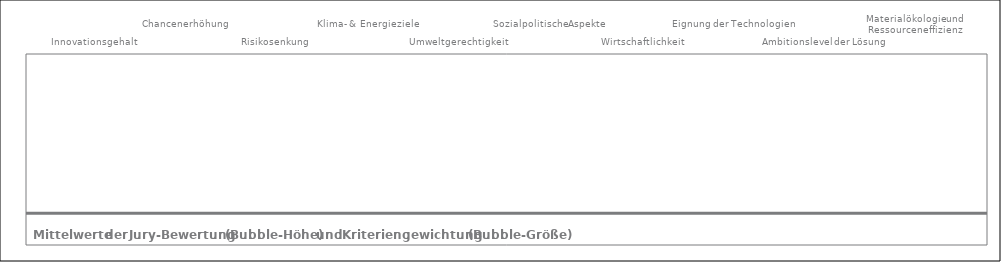
| Category | Mittelwert |
|---|---|
| 0 | 0 |
| 1 | 0 |
| 2 | 0 |
| 3 | 0 |
| 4 | 0 |
| 5 | 0 |
| 6 | 0 |
| 7 | 0 |
| 8 | 0 |
| 9 | 0 |
| 10 | 0 |
| 11 | 0 |
| 12 | 0 |
| 13 | 0 |
| 14 | 0 |
| 15 | 0 |
| 16 | 0 |
| 17 | 0 |
| 18 | 0 |
| 19 | 0 |
| 20 | 0 |
| 21 | 0 |
| 22 | 0 |
| 23 | 0 |
| 24 | 0 |
| 25 | 0 |
| 26 | 0 |
| 27 | 0 |
| 28 | 0 |
| 29 | 0 |
| 30 | 0 |
| 31 | 0 |
| 32 | 0 |
| 33 | 0 |
| 34 | 0 |
| 35 | 0 |
| 36 | 0 |
| 37 | 0 |
| 38 | 0 |
| 39 | 0 |
| 40 | 0 |
| 41 | 0 |
| 42 | 0 |
| 43 | 0 |
| 44 | 0 |
| 45 | 0 |
| 46 | 0 |
| 47 | 0 |
| 48 | 0 |
| 49 | 0 |